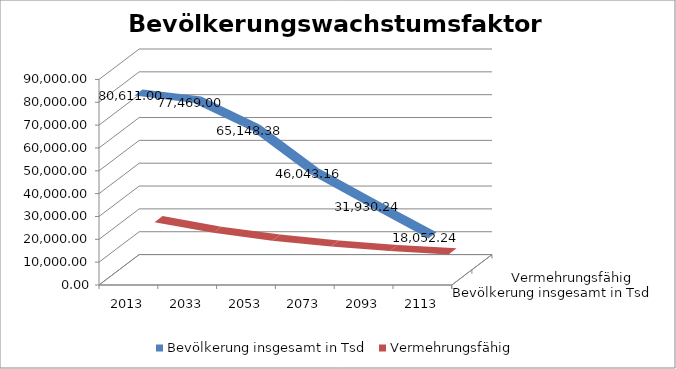
| Category | Bevölkerung insgesamt in Tsd | Vermehrungsfähig |
|---|---|---|
| 2013.0 | 80611 | 18504 |
| 2033.0 | 77469 | 13878 |
| 2053.0 | 65148.375 | 10408.5 |
| 2073.0 | 46043.156 | 7806.375 |
| 2093.0 | 31930.242 | 5854.781 |
| 2113.0 | 18052.242 | 4391.086 |